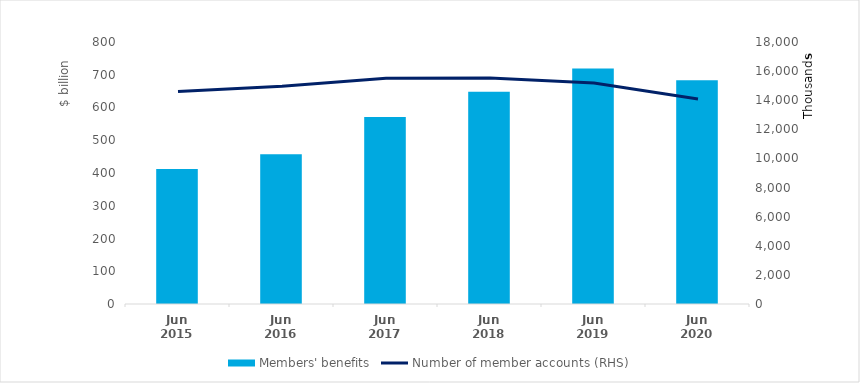
| Category | Members' benefits |
|---|---|
| 0 | 412 |
| 1 | 457 |
| 2 | 571 |
| 3 | 648 |
| 4 | 719 |
| 5 | 683 |